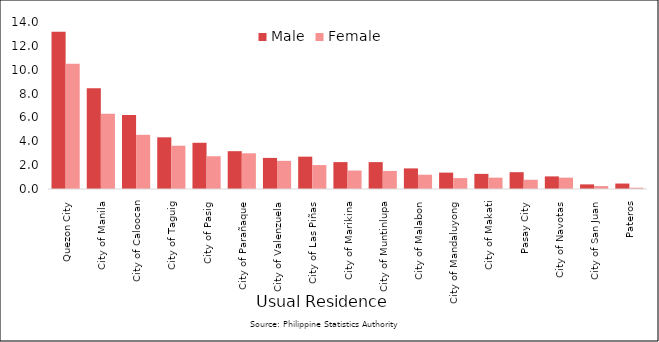
| Category | Male | Female |
|---|---|---|
|  Quezon City | 13.174 | 10.497 |
|  City of Manila | 8.454 | 6.305 |
|  City of Caloocan | 6.199 | 4.544 |
|  City of Taguig | 4.333 | 3.628 |
|  City of Pasig | 3.875 | 2.747 |
|  City of Parañaque | 3.17 | 2.994 |
|  City of Valenzuela | 2.607 | 2.36 |
|  City of Las Piñas | 2.712 | 2.008 |
|  City of Marikina | 2.254 | 1.55 |
|  City of Muntinlupa | 2.254 | 1.515 |
|  City of Malabon | 1.726 | 1.198 |
|  City of Mandaluyong | 1.374 | 0.916 |
|  City of Makati | 1.268 | 0.951 |
|  Pasay City | 1.409 | 0.775 |
|  City of Navotas | 1.057 | 0.951 |
|  City of San Juan | 0.387 | 0.247 |
|  Pateros | 0.458 | 0.106 |